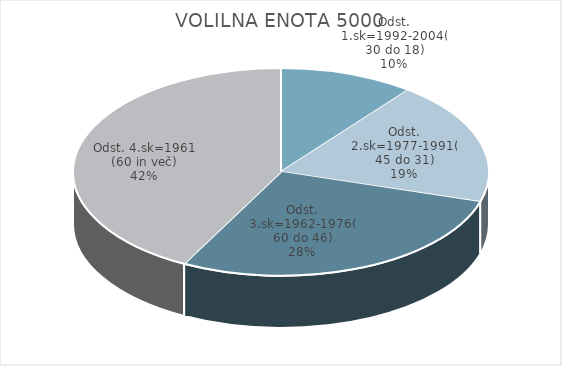
| Category | VOLILNA ENOTA 5000 |
|---|---|
| Odst. 1.sk=1992-2004(30 do 18) | 5.64 |
| Odst. 2.sk=1977-1991(45 do 31) | 10.3 |
| Odst. 3.sk=1962-1976(60 do 46) | 15.06 |
| Odst. 4.sk=1961 (60 in več) | 22.72 |